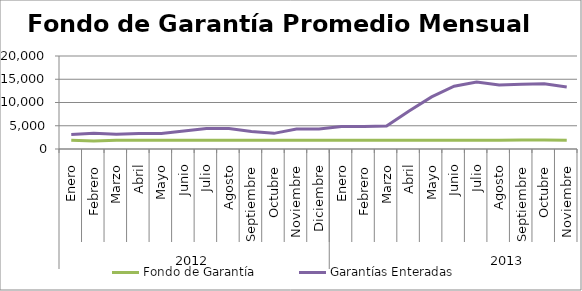
| Category | Fondo de Garantía | Garantías Enteradas |
|---|---|---|
| 0 | 1896.798 | 3141.641 |
| 1 | 1714.423 | 3362.648 |
| 2 | 1900.513 | 3154.118 |
| 3 | 1900.513 | 3348.058 |
| 4 | 1898.685 | 3308.859 |
| 5 | 1900.513 | 3850.375 |
| 6 | 1900.513 | 4400.539 |
| 7 | 1895.388 | 4383.327 |
| 8 | 1900.513 | 3757.632 |
| 9 | 1900.513 | 3362.932 |
| 10 | 1900.311 | 4285.609 |
| 11 | 1890.98 | 4296.87 |
| 12 | 1898.667 | 4842.786 |
| 13 | 1900.512 | 4845.136 |
| 14 | 1900.513 | 4938.365 |
| 15 | 1900.513 | 8179.666 |
| 16 | 1900.513 | 11202.213 |
| 17 | 1900.513 | 13493.433 |
| 18 | 1900.513 | 14387.844 |
| 19 | 1900.496 | 13769.803 |
| 20 | 1951.853 | 13899.147 |
| 21 | 1948.554 | 14005.922 |
| 22 | 1900.511 | 13346.59 |